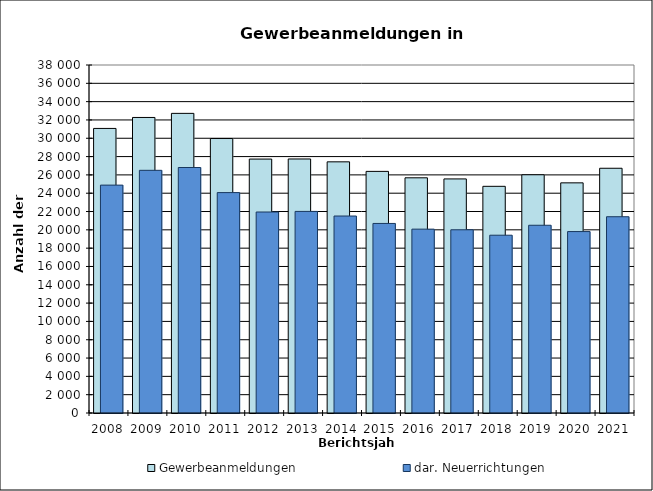
| Category | Gewerbeanmeldungen | dar. Neuerrichtungen |
|---|---|---|
| 2008.0 | 31074 | 24884 |
| 2009.0 | 32271 | 26499 |
| 2010.0 | 32718 | 26806 |
| 2011.0 | 29971 | 24066 |
| 2012.0 | 27728 | 21948 |
| 2013.0 | 27739 | 22013 |
| 2014.0 | 27426 | 21509 |
| 2015.0 | 26383 | 20698 |
| 2016.0 | 25683 | 20075 |
| 2017.0 | 25561 | 20008 |
| 2018.0 | 24752 | 19413 |
| 2019.0 | 26015 | 20501 |
| 2020.0 | 25132 | 19811 |
| 2021.0 | 26724 | 21433 |